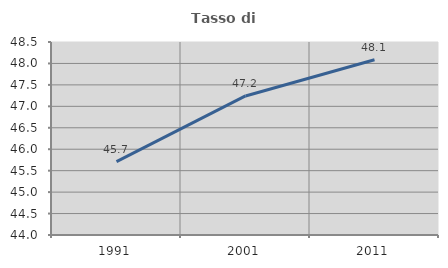
| Category | Tasso di occupazione   |
|---|---|
| 1991.0 | 45.709 |
| 2001.0 | 47.242 |
| 2011.0 | 48.085 |